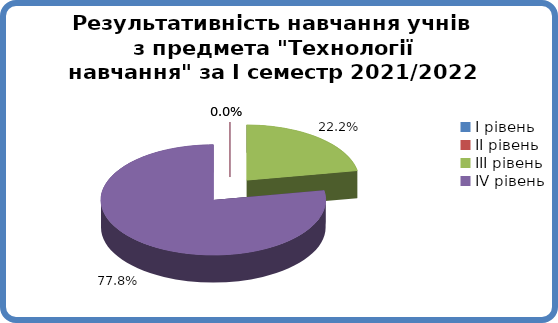
| Category | Series 0 |
|---|---|
| 0 | 0 |
| 1 | 0 |
| 2 | 0.222 |
| 3 | 0.778 |